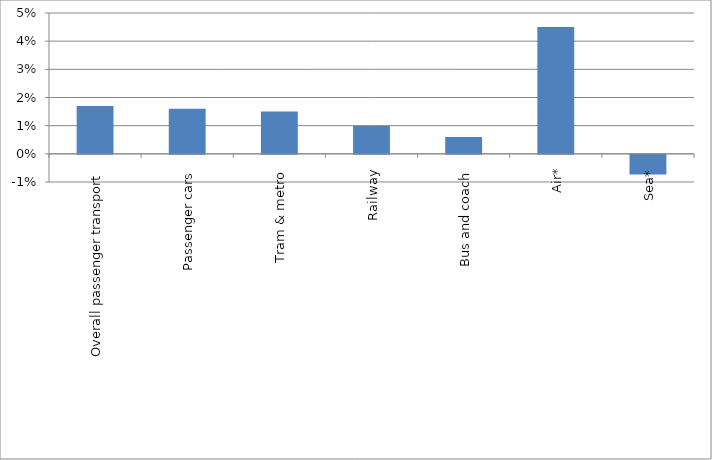
| Category | Series 0 |
|---|---|
| Overall passenger transport | 0.017 |
| Passenger cars | 0.016 |
| Tram & metro | 0.015 |
| Railway | 0.01 |
| Bus and coach | 0.006 |
| Air* | 0.045 |
| Sea* | -0.007 |